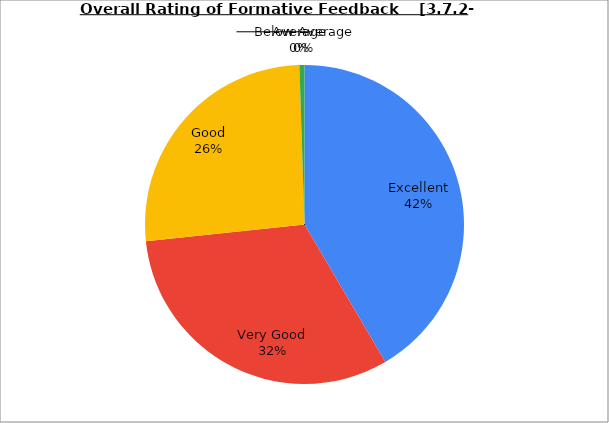
| Category | Series 0 |
|---|---|
| Excellent | 41.538 |
| Very Good | 31.795 |
| Good | 26.154 |
| Average | 0.513 |
| Below Average | 0 |